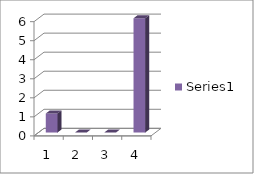
| Category | Series 0 |
|---|---|
| 0 | 1 |
| 1 | 0 |
| 2 | 0 |
| 3 | 6 |